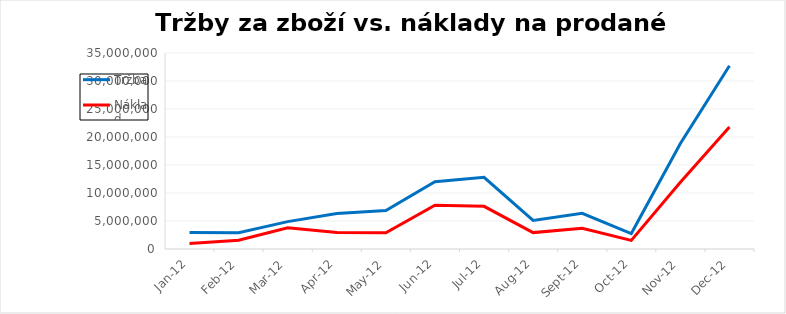
| Category | Tržba | Náklad |
|---|---|---|
| 2012-01-01 | 2928307.89 | 971531.51 |
| 2012-02-01 | 2887821.62 | 1557721.422 |
| 2012-03-01 | 4885452.67 | 3808156.824 |
| 2012-04-01 | 6339471.56 | 2925522.095 |
| 2012-05-01 | 6853575.9 | 2906896.26 |
| 2012-06-01 | 11997312.36 | 7812724.71 |
| 2012-07-01 | 12812363.48 | 7619910.76 |
| 2012-08-01 | 5093952.3 | 2925879.6 |
| 2012-09-01 | 6364004.47 | 3704560.24 |
| 2012-10-01 | 2763615.28 | 1530209.867 |
| 2012-11-01 | 18840137.08 | 11923921.94 |
| 2012-12-01 | 32724411.34 | 21791839.82 |